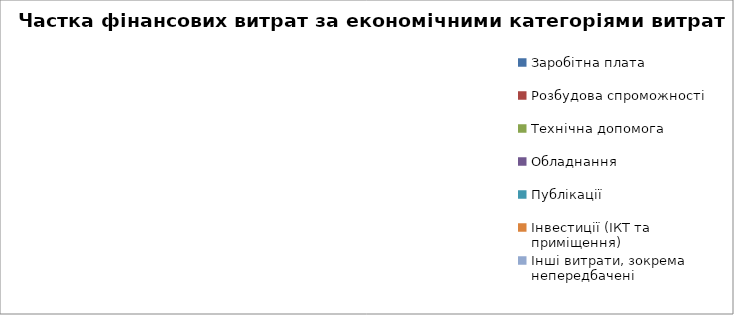
| Category | Разом |
|---|---|
| Заробітна плата | 0 |
| Розбудова спроможності | 0 |
| Технічна допомога | 0 |
| Обладнання | 0 |
| Публікації | 0 |
| Інвестиції (ІКТ та приміщення) | 0 |
| Інші витрати, зокрема непередбачені | 0 |